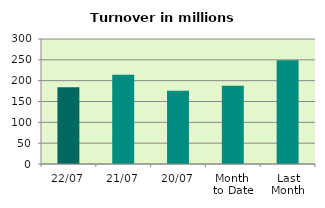
| Category | Series 0 |
|---|---|
| 22/07 | 184.005 |
| 21/07 | 214.225 |
| 20/07 | 175.779 |
| Month 
to Date | 187.788 |
| Last
Month | 248.976 |